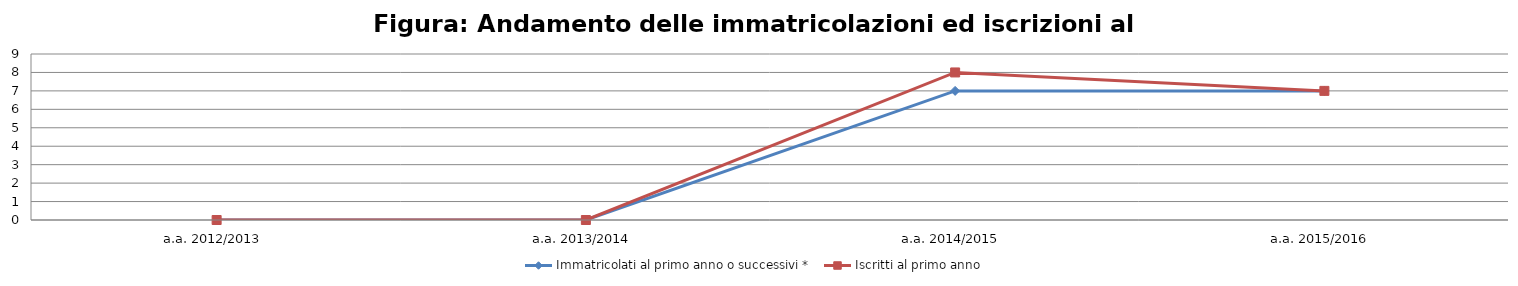
| Category | Immatricolati al primo anno o successivi * | Iscritti al primo anno  |
|---|---|---|
| a.a. 2012/2013 | 0 | 0 |
| a.a. 2013/2014 | 0 | 0 |
| a.a. 2014/2015 | 7 | 8 |
| a.a. 2015/2016 | 7 | 7 |